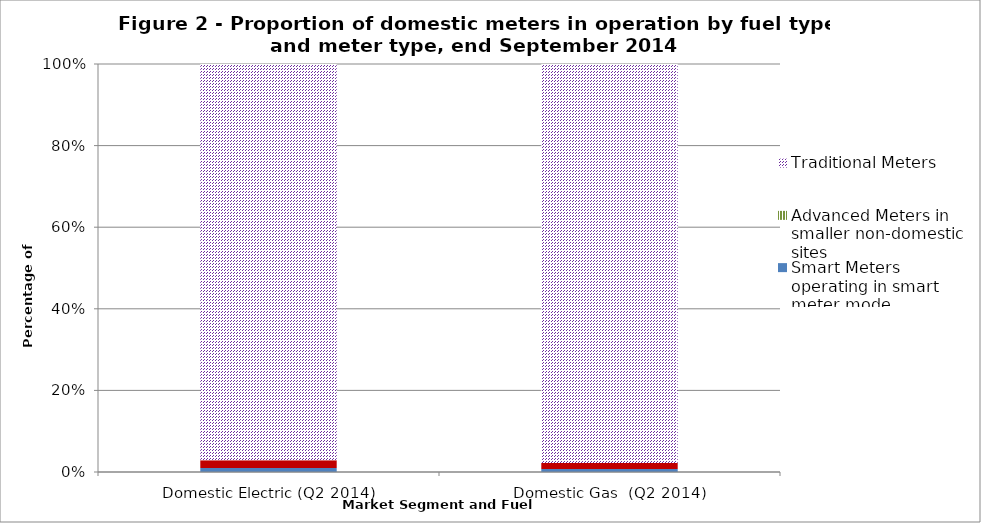
| Category | Smart Meters operating in smart meter mode | Smart-Type Meters in domestic properties | Advanced Meters in smaller non-domestic sites | Traditional Meters |
|---|---|---|---|---|
| Domestic Electric (Q2 2014) | 246447 | 492939 | 0 | 24990226 |
| Domestic Gas  (Q2 2014) | 156190 | 308358 | 0 | 20774487 |